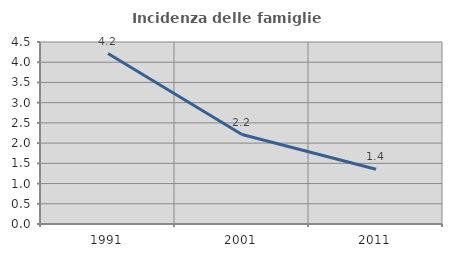
| Category | Incidenza delle famiglie numerose |
|---|---|
| 1991.0 | 4.213 |
| 2001.0 | 2.211 |
| 2011.0 | 1.354 |